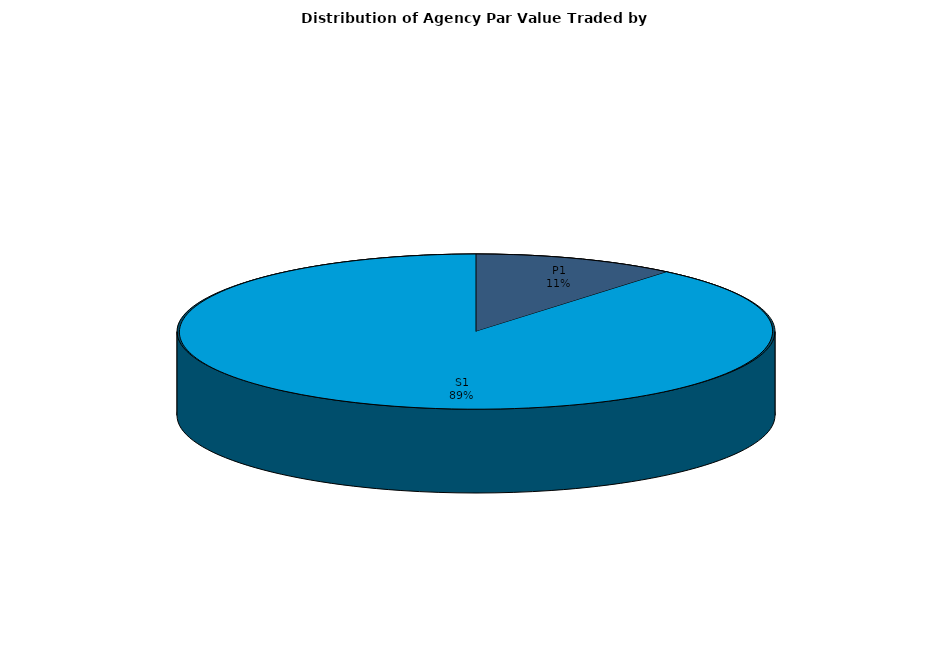
| Category | Series 0 |
|---|---|
| P1 | 1326968906.374 |
| S1 | 10699856473.852 |